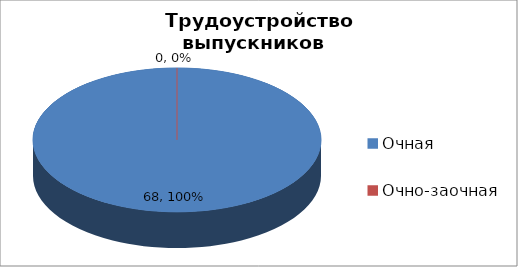
| Category | 2015 г. |
|---|---|
| Очная | 68 |
| Очно-заочная | 0 |